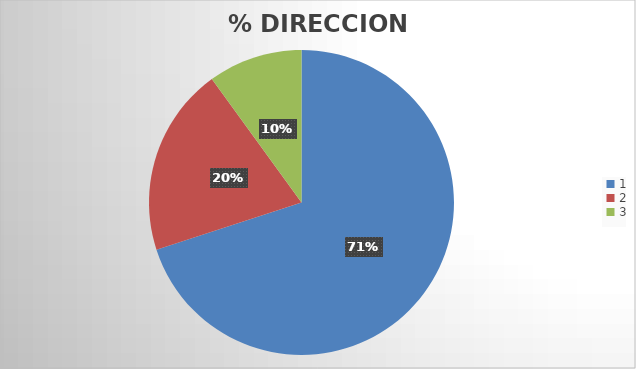
| Category | Series 0 |
|---|---|
| 0 | 0.7 |
| 1 | 0.2 |
| 2 | 0.1 |